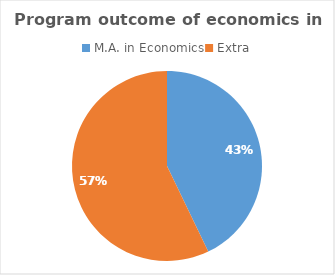
| Category | Series 0 |
|---|---|
| M.A. in Economics | 3 |
| Extra | 4 |